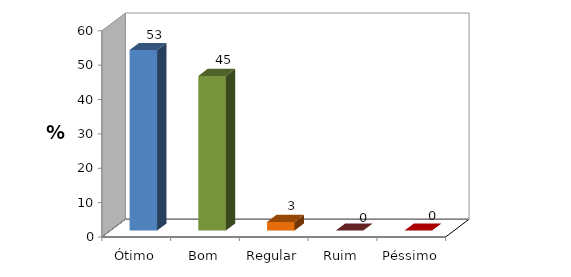
| Category | Series 0 |
|---|---|
| Ótimo | 52.5 |
| Bom | 45 |
| Regular | 2.5 |
| Ruim | 0 |
| Péssimo | 0 |